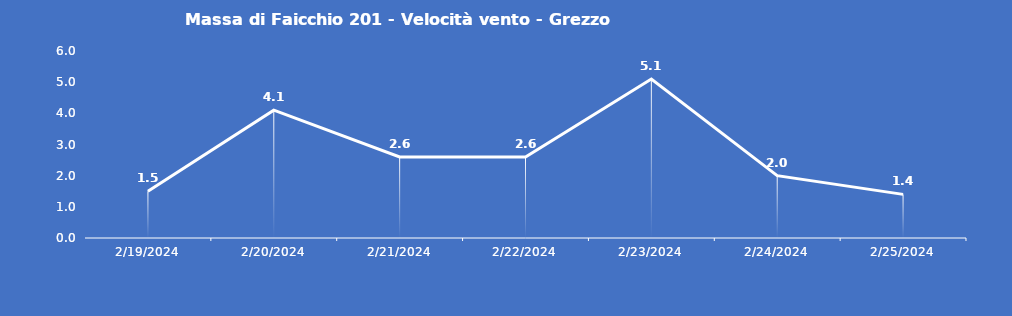
| Category | Massa di Faicchio 201 - Velocità vento - Grezzo (m/s) |
|---|---|
| 2/19/24 | 1.5 |
| 2/20/24 | 4.1 |
| 2/21/24 | 2.6 |
| 2/22/24 | 2.6 |
| 2/23/24 | 5.1 |
| 2/24/24 | 2 |
| 2/25/24 | 1.4 |